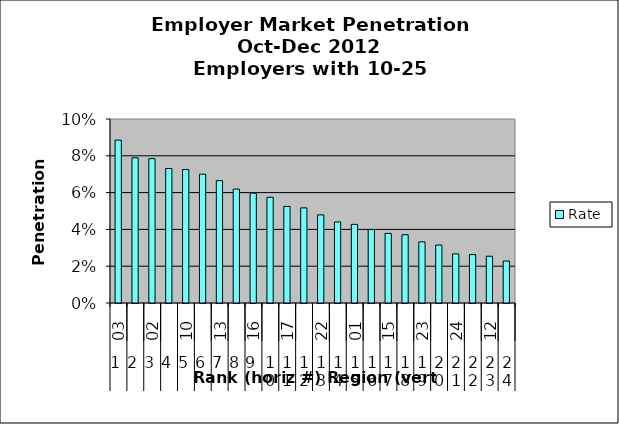
| Category | Rate |
|---|---|
| 0 | 0.089 |
| 1 | 0.079 |
| 2 | 0.078 |
| 3 | 0.073 |
| 4 | 0.073 |
| 5 | 0.07 |
| 6 | 0.066 |
| 7 | 0.062 |
| 8 | 0.06 |
| 9 | 0.057 |
| 10 | 0.052 |
| 11 | 0.052 |
| 12 | 0.048 |
| 13 | 0.044 |
| 14 | 0.043 |
| 15 | 0.04 |
| 16 | 0.038 |
| 17 | 0.037 |
| 18 | 0.033 |
| 19 | 0.032 |
| 20 | 0.027 |
| 21 | 0.026 |
| 22 | 0.025 |
| 23 | 0.023 |